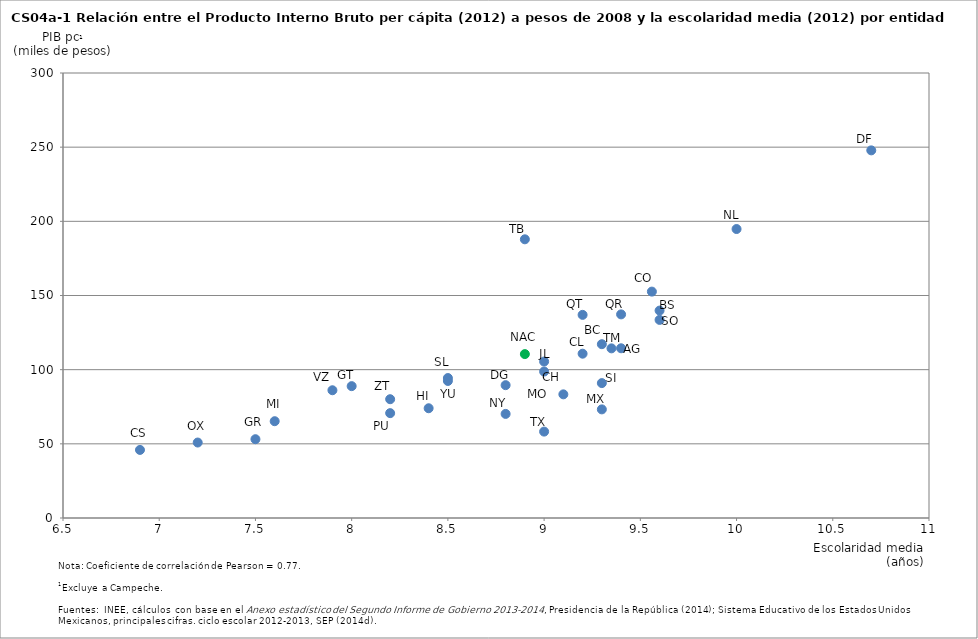
| Category | Series 0 |
|---|---|
| 9.4 | 114419.9 |
| 9.35 | 114367.5 |
| 9.6 | 139838.7 |
| 9.56 | 152622.5 |
| 9.2 | 110763.9 |
| 6.9 | 45901.1 |
| 9.0 | 98749 |
| 10.7 | 247842.8 |
| 8.8 | 89552.5 |
| 8.0 | 88890.6 |
| 7.5 | 53125.7 |
| 8.4 | 73989.8 |
| 9.0 | 105482.3 |
| 9.3 | 73227.5 |
| 7.6 | 65254.2 |
| 9.1 | 83363.8 |
| 8.8 | 70173.9 |
| 10.0 | 194811.9 |
| 7.2 | 50877.5 |
| 8.2 | 70689 |
| 9.2 | 136942 |
| 9.4 | 137269.3 |
| 8.5 | 94364.6 |
| 9.3 | 90946.6 |
| 9.6 | 133556.5 |
| 8.9 | 187885.4 |
| 9.3 | 117171.5 |
| 9.0 | 58243.5 |
| 7.9 | 86128.8 |
| 8.5 | 92394.8 |
| 8.2 | 80077.5 |
| 8.9 | 110493.5 |